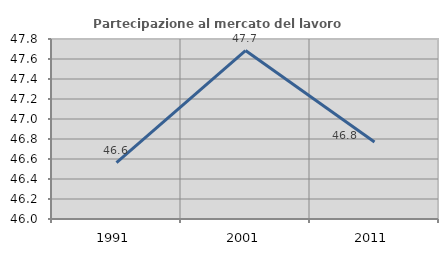
| Category | Partecipazione al mercato del lavoro  femminile |
|---|---|
| 1991.0 | 46.564 |
| 2001.0 | 47.685 |
| 2011.0 | 46.769 |